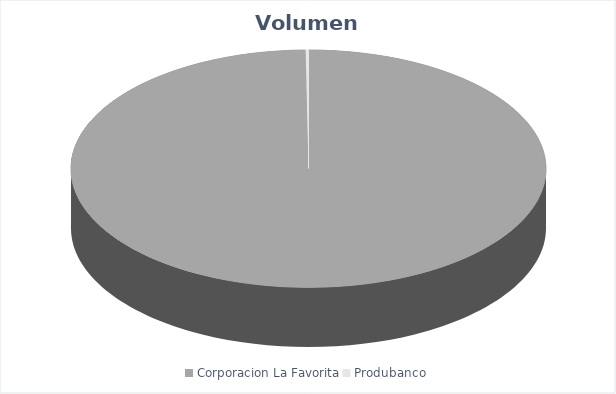
| Category | VOLUMEN ($USD) |
|---|---|
| Corporacion La Favorita | 115046.68 |
| Produbanco | 223.65 |